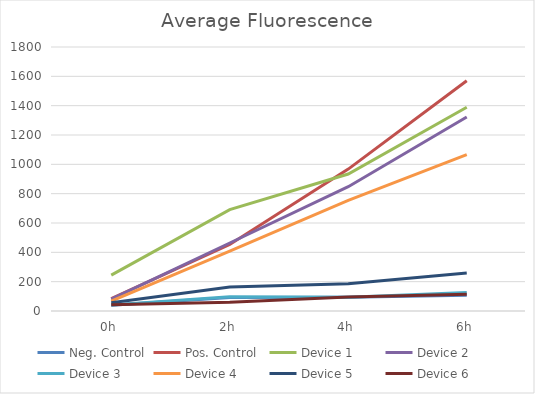
| Category | Neg. Control | Pos. Control | Device 1 | Device 2 | Device 3 | Device 4 | Device 5 | Device 6 |
|---|---|---|---|---|---|---|---|---|
| 0h | 39.756 | 84.623 | 244.444 | 80.456 | 40.787 | 66.662 | 56.734 | 43.007 |
| 2h | 91.218 | 453.273 | 690.982 | 463.522 | 97.85 | 408.22 | 163.096 | 60.103 |
| 4h | 93.225 | 967.567 | 934.032 | 847.684 | 94.59 | 753.726 | 186.078 | 96.158 |
| 6h | 107.851 | 1569.428 | 1389.516 | 1322.4 | 125.886 | 1066.439 | 258.713 | 114.295 |